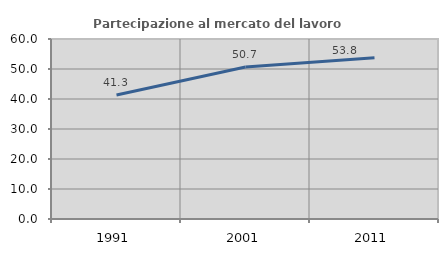
| Category | Partecipazione al mercato del lavoro  femminile |
|---|---|
| 1991.0 | 41.32 |
| 2001.0 | 50.668 |
| 2011.0 | 53.777 |